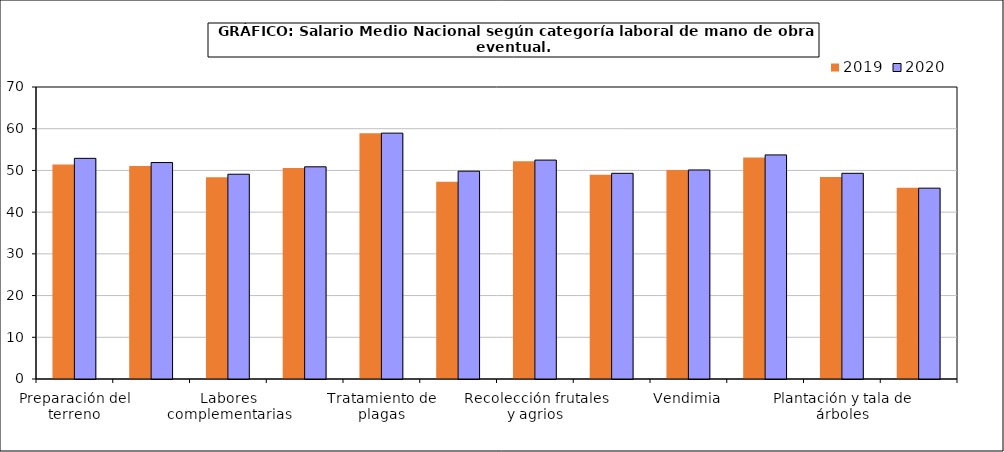
| Category | 2019 | 2020 |
|---|---|---|
| 0 | 51.4 | 52.9 |
| 1 | 51.08 | 51.89 |
| 2 | 48.36 | 49.09 |
| 3 | 50.57 | 50.87 |
| 4 | 58.93 | 58.94 |
| 5 | 47.26 | 49.82 |
| 6 | 52.19 | 52.48 |
| 7 | 48.97 | 49.31 |
| 8 | 50.1 | 50.11 |
| 9 | 53.09 | 53.72 |
| 10 | 48.41 | 49.31 |
| 11 | 45.87 | 45.75 |